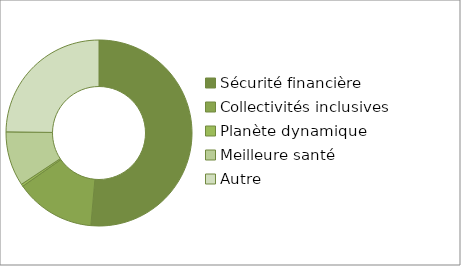
| Category | Series 0 |
|---|---|
| Sécurité financière | 0.514 |
| Collectivités inclusives | 0.139 |
| Planète dynamique | 0.004 |
| Meilleure santé | 0.095 |
| Autre | 0.248 |